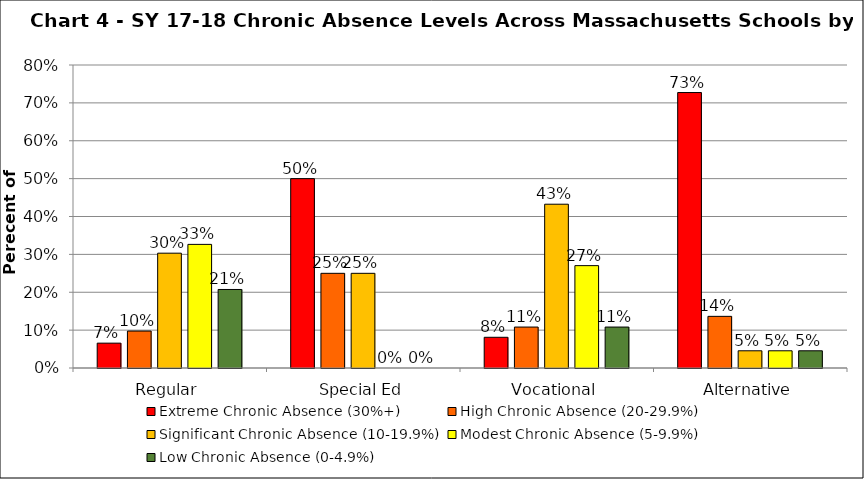
| Category | Extreme Chronic Absence (30%+) | High Chronic Absence (20-29.9%) | Significant Chronic Absence (10-19.9%) | Modest Chronic Absence (5-9.9%) | Low Chronic Absence (0-4.9%) |
|---|---|---|---|---|---|
| 0 | 0.066 | 0.098 | 0.303 | 0.326 | 0.207 |
| 1 | 0.5 | 0.25 | 0.25 | 0 | 0 |
| 2 | 0.081 | 0.108 | 0.432 | 0.27 | 0.108 |
| 3 | 0.727 | 0.136 | 0.045 | 0.045 | 0.045 |